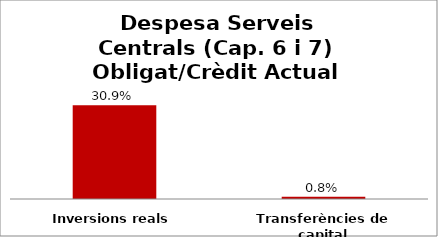
| Category | Series 0 |
|---|---|
| Inversions reals | 0.309 |
| Transferències de capital | 0.008 |